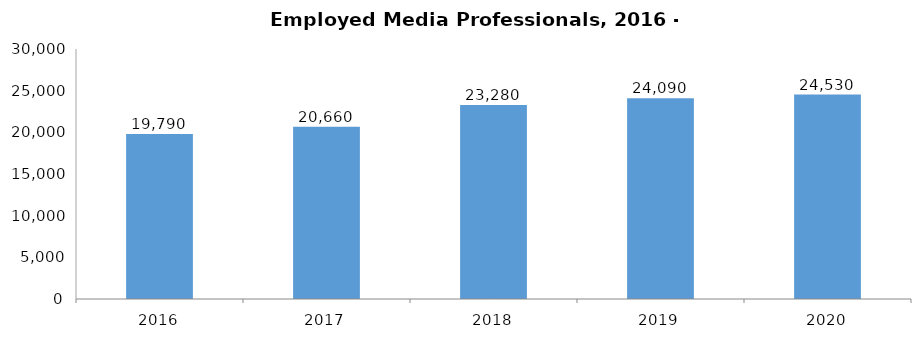
| Category | Employed Media Professionals |
|---|---|
| 2016.0 | 19790 |
| 2017.0 | 20660 |
| 2018.0 | 23280 |
| 2019.0 | 24090 |
| 2020.0 | 24530 |